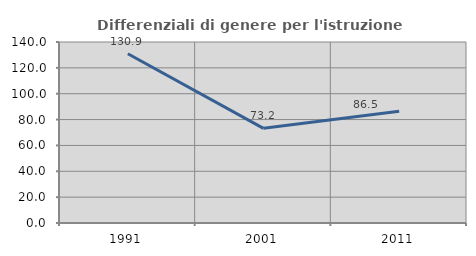
| Category | Differenziali di genere per l'istruzione superiore |
|---|---|
| 1991.0 | 130.941 |
| 2001.0 | 73.2 |
| 2011.0 | 86.493 |